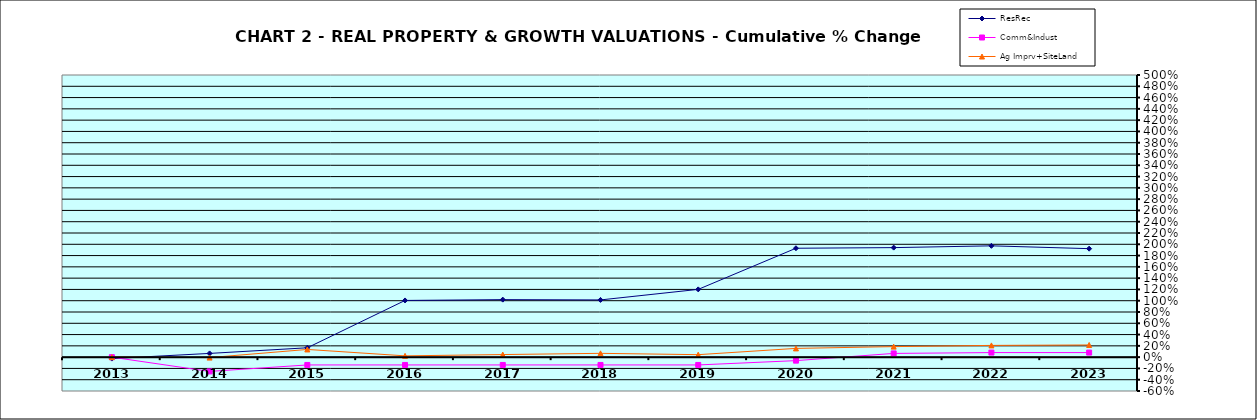
| Category | ResRec | Comm&Indust | Ag Imprv+SiteLand |
|---|---|---|---|
| 2013.0 | -0.026 | 0 | 0 |
| 2014.0 | 0.066 | -0.253 | -0.008 |
| 2015.0 | 0.166 | -0.138 | 0.136 |
| 2016.0 | 1.005 | -0.138 | 0.023 |
| 2017.0 | 1.019 | -0.138 | 0.046 |
| 2018.0 | 1.014 | -0.138 | 0.067 |
| 2019.0 | 1.201 | -0.138 | 0.044 |
| 2020.0 | 1.93 | -0.062 | 0.155 |
| 2021.0 | 1.941 | 0.066 | 0.186 |
| 2022.0 | 1.973 | 0.081 | 0.208 |
| 2023.0 | 1.922 | 0.081 | 0.216 |